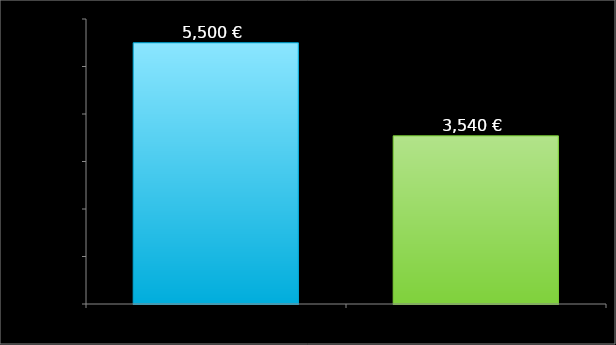
| Category | Series 0 |
|---|---|
| 0 | 5500 |
| 1 | 3540 |